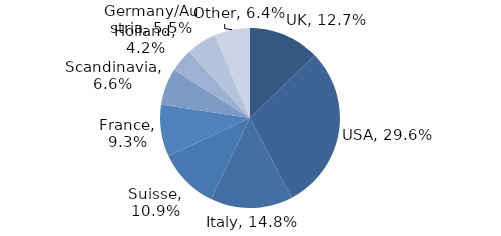
| Category | Investment Style |
|---|---|
| UK | 0.127 |
| USA | 0.296 |
| Italy | 0.148 |
| Suisse | 0.109 |
| France | 0.093 |
| Scandinavia | 0.066 |
| Holland | 0.042 |
| Germany/Austria | 0.055 |
| Other | 0.064 |